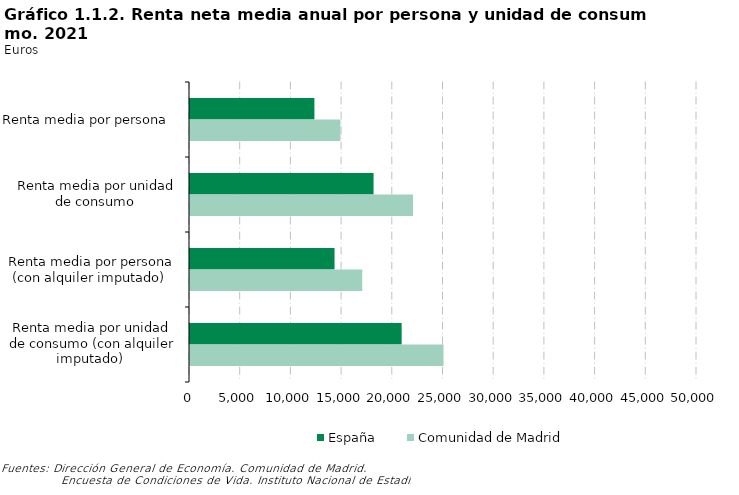
| Category | España | Comunidad de Madrid |
|---|---|---|
| Renta media por persona  | 12269 | 14836 |
| Renta media por unidad de consumo  | 18103 | 21990 |
| Renta media por persona (con alquiler imputado)  | 14255 | 16985 |
| Renta media por unidad de consumo (con alquiler imputado)  | 20874 | 25000 |